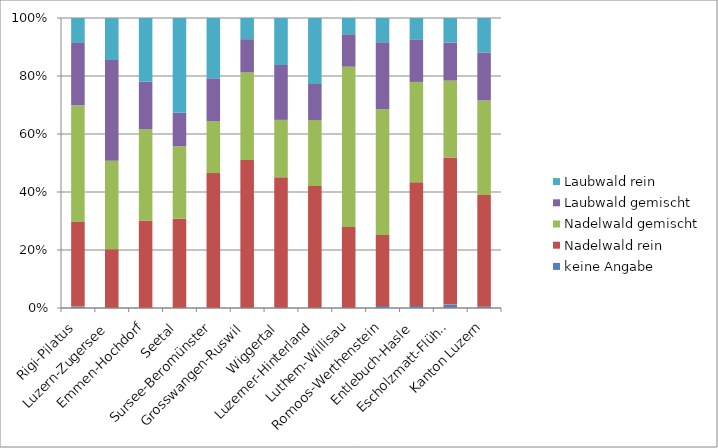
| Category | keine Angabe | Nadelwald rein | Nadelwald gemischt | Laubwald gemischt | Laubwald rein |
|---|---|---|---|---|---|
| Rigi-Pilatus | 25 | 1536 | 2115 | 1133 | 453 |
| Luzern-Zugersee | 0 | 346 | 519 | 593 | 247 |
| Emmen-Hochdorf | 0 | 552 | 577 | 301 | 402 |
| Seetal | 0 | 397 | 323 | 149 | 422 |
| Sursee-Beromünster | 0 | 1179 | 452 | 376 | 527 |
| Grosswangen-Ruswil | 0 | 1209 | 716 | 271 | 173 |
| Wiggertal | 0 | 1262 | 555 | 530 | 454 |
| Luzerner-Hinterland | 0 | 920 | 497 | 273 | 497 |
| Luthern-Willisau | 0 | 1004 | 1983 | 402 | 201 |
| Romoos-Werthenstein | 25 | 871 | 1543 | 821 | 299 |
| Entlebuch-Hasle | 25 | 1457 | 1181 | 502 | 251 |
| Escholzmatt-Flühli | 100 | 4340 | 2270 | 1123 | 723 |
| Kanton Luzern | 175 | 15074 | 12730 | 6475 | 4649 |